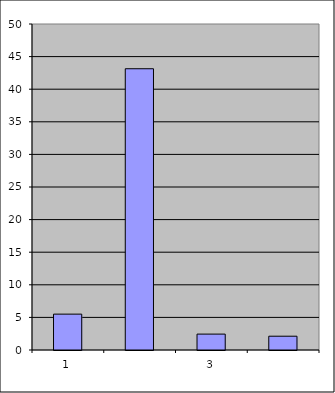
| Category | Series 0 |
|---|---|
| 0 | 5.5 |
| 1 | 43.138 |
| 2 | 2.437 |
| 3 | 2.115 |